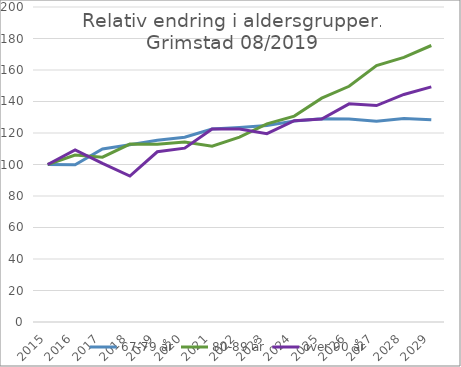
| Category | 67-79 år | 80-89 år | over 90 år |
|---|---|---|---|
| 2015.0 | 100 | 100 | 100 |
| 2016.0 | 99.887 | 105.993 | 109.298 |
| 2017.0 | 109.859 | 104.639 | 100.759 |
| 2018.0 | 112.477 | 112.963 | 92.694 |
| 2019.0 | 115.42 | 112.866 | 108.073 |
| 2020.0 | 117.277 | 114.317 | 110.376 |
| 2021.0 | 122.547 | 111.56 | 122.525 |
| 2022.0 | 123.552 | 117.33 | 122.539 |
| 2023.0 | 124.819 | 125.774 | 119.607 |
| 2024.0 | 127.561 | 130.717 | 127.785 |
| 2025.0 | 129.076 | 142.096 | 128.918 |
| 2026.0 | 128.951 | 149.675 | 138.531 |
| 2027.0 | 127.417 | 162.819 | 137.42 |
| 2028.0 | 129.213 | 167.997 | 144.474 |
| 2029.0 | 128.386 | 175.555 | 149.27 |